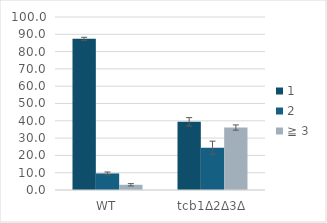
| Category | 1 | 2 | ≧ 3 |
|---|---|---|---|
| WT | 87.407 | 9.579 | 3.014 |
| tcb1Δ2Δ3Δ | 39.409 | 24.488 | 36.102 |